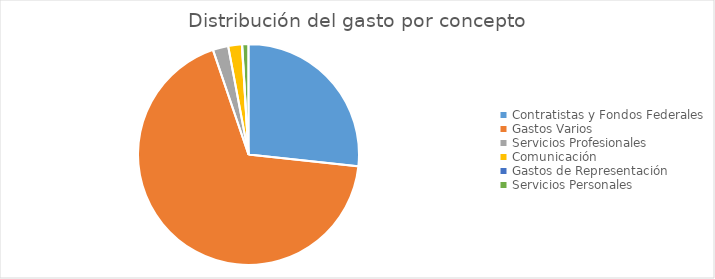
| Category | Series 0 |
|---|---|
| Contratistas y Fondos Federales | 141237748.33 |
| Gastos Varios | 360115097.26 |
| Servicios Profesionales | 11941990.56 |
| Comunicación | 10577794.98 |
| Gastos de Representación | 197687.3 |
| Servicios Personales | 4863517.4 |